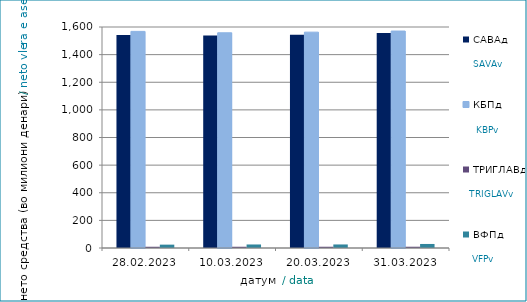
| Category | САВАд | КБПд | ТРИГЛАВд | ВФПд |
|---|---|---|---|---|
| 2023-02-28 | 1542.774 | 1568.196 | 9.024 | 24.327 |
| 2023-03-10 | 1538.821 | 1558.084 | 9.028 | 25.541 |
| 2023-03-20 | 1544.488 | 1562.755 | 9.067 | 25.68 |
| 2023-03-31 | 1556.824 | 1570.69 | 9.153 | 29.205 |